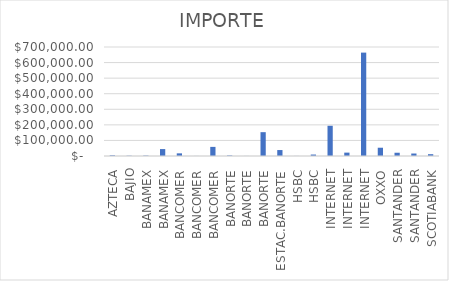
| Category | IMPORTE |
|---|---|
| AZTECA | 4341.4 |
| BAJIO | 1766.82 |
| BANAMEX | 2552.34 |
| BANAMEX | 44452.47 |
| BANCOMER | 17043.42 |
| BANCOMER | 376 |
| BANCOMER | 58510.22 |
| BANORTE | 3392.48 |
| BANORTE | 376 |
| BANORTE | 153055.3 |
| ESTAC.BANORTE | 38231.5 |
| HSBC | 403.49 |
| HSBC | 9318.79 |
| INTERNET | 194170.68 |
| INTERNET | 21690.27 |
| INTERNET | 663973.93 |
| OXXO | 53122.14 |
| SANTANDER | 20948.13 |
| SANTANDER | 15918.98 |
| SCOTIABANK | 11633.8 |